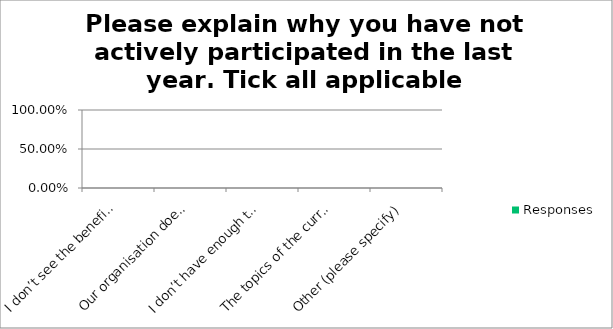
| Category | Responses |
|---|---|
| I don’t see the benefits in participating | 0 |
| Our organisation doesn’t have enough resource | 0 |
| I don’t have enough time | 0 |
| The topics of the current workstreams are not relevant / interesting to me | 0 |
| Other (please specify) | 0 |